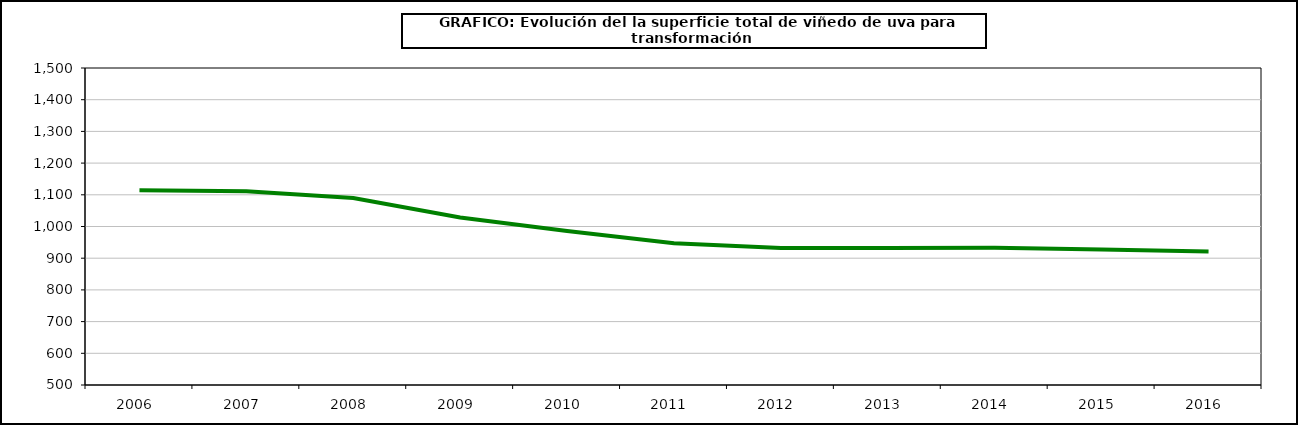
| Category | superficie |
|---|---|
| 2006.0 | 1114.598 |
| 2007.0 | 1111.237 |
| 2008.0 | 1090.027 |
| 2009.0 | 1028.258 |
| 2010.0 | 985.844 |
| 2011.0 | 947.36 |
| 2012.0 | 931.893 |
| 2013.0 | 932.509 |
| 2014.0 | 932.611 |
| 2015.0 | 927.067 |
| 2016.0 | 921.18 |